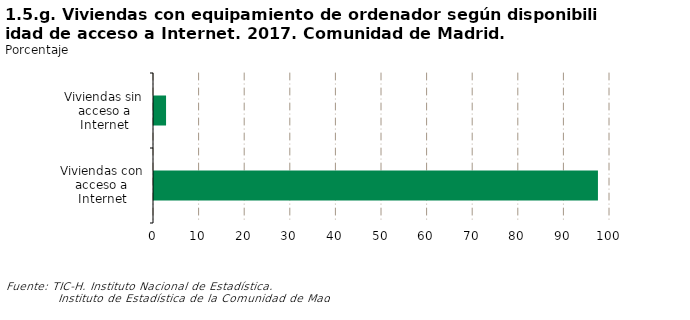
| Category | Series 0 |
|---|---|
| Viviendas con acceso a Internet | 97.356 |
| Viviendas sin acceso a Internet | 2.644 |